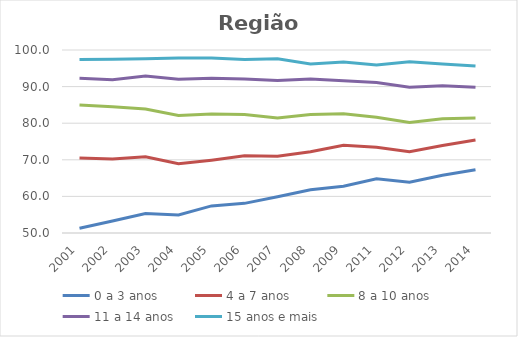
| Category | 0 a 3 anos | 4 a 7 anos | 8 a 10 anos | 11 a 14 anos | 15 anos e mais |
|---|---|---|---|---|---|
| 2001.0 | 51.3 | 70.5 | 85 | 92.3 | 97.4 |
| 2002.0 | 53.3 | 70.2 | 84.5 | 91.9 | 97.5 |
| 2003.0 | 55.3 | 70.8 | 83.9 | 92.9 | 97.6 |
| 2004.0 | 54.9 | 68.9 | 82.1 | 92 | 97.8 |
| 2005.0 | 57.4 | 69.9 | 82.5 | 92.3 | 97.8 |
| 2006.0 | 58.1 | 71.1 | 82.4 | 92.1 | 97.4 |
| 2007.0 | 59.9 | 71 | 81.4 | 91.7 | 97.6 |
| 2008.0 | 61.8 | 72.2 | 82.4 | 92.1 | 96.2 |
| 2009.0 | 62.8 | 74 | 82.6 | 91.6 | 96.7 |
| 2011.0 | 64.8 | 73.4 | 81.6 | 91.1 | 95.9 |
| 2012.0 | 63.9 | 72.2 | 80.2 | 89.8 | 96.8 |
| 2013.0 | 65.8 | 73.9 | 81.2 | 90.2 | 96.2 |
| 2014.0 | 67.3 | 75.4 | 81.4 | 89.8 | 95.6 |